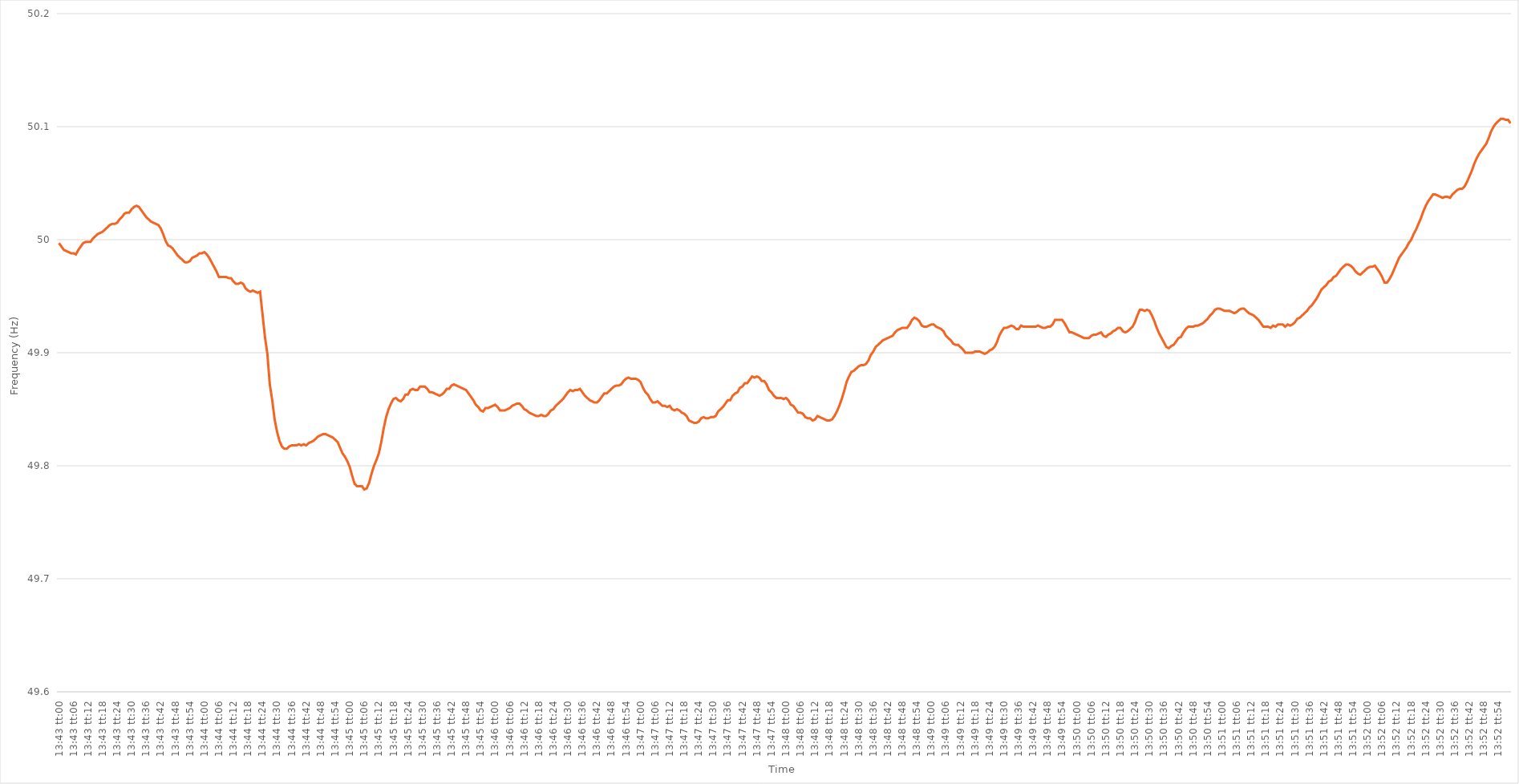
| Category | Series 0 |
|---|---|
| 0.5715277777777777 | 49.997 |
| 0.5715393518518518 | 49.994 |
| 0.5715509259259259 | 49.991 |
| 0.5715625 | 49.99 |
| 0.5715740740740741 | 49.989 |
| 0.5715856481481482 | 49.988 |
| 0.5715972222222222 | 49.988 |
| 0.5716087962962962 | 49.987 |
| 0.5716203703703704 | 49.991 |
| 0.5716319444444444 | 49.994 |
| 0.5716435185185186 | 49.997 |
| 0.5716550925925926 | 49.998 |
| 0.5716666666666667 | 49.998 |
| 0.5716782407407407 | 49.998 |
| 0.5716898148148148 | 50.001 |
| 0.5717013888888889 | 50.003 |
| 0.571712962962963 | 50.005 |
| 0.5717245370370371 | 50.006 |
| 0.5717361111111111 | 50.007 |
| 0.5717476851851852 | 50.009 |
| 0.5717592592592592 | 50.011 |
| 0.5717708333333333 | 50.013 |
| 0.5717824074074074 | 50.014 |
| 0.5717939814814815 | 50.014 |
| 0.5718055555555556 | 50.015 |
| 0.5718171296296296 | 50.018 |
| 0.5718287037037036 | 50.02 |
| 0.5718402777777778 | 50.023 |
| 0.5718518518518518 | 50.024 |
| 0.571863425925926 | 50.024 |
| 0.571875 | 50.027 |
| 0.5718865740740741 | 50.029 |
| 0.5718981481481481 | 50.03 |
| 0.5719097222222222 | 50.029 |
| 0.5719212962962963 | 50.026 |
| 0.5719328703703704 | 50.023 |
| 0.5719444444444445 | 50.02 |
| 0.5719560185185185 | 50.018 |
| 0.5719675925925926 | 50.016 |
| 0.5719791666666666 | 50.015 |
| 0.5719907407407407 | 50.014 |
| 0.5720023148148148 | 50.013 |
| 0.5720138888888889 | 50.01 |
| 0.572025462962963 | 50.005 |
| 0.572037037037037 | 49.999 |
| 0.572048611111111 | 49.995 |
| 0.5720601851851852 | 49.994 |
| 0.5720717592592592 | 49.992 |
| 0.5720833333333334 | 49.989 |
| 0.5720949074074074 | 49.986 |
| 0.5721064814814815 | 49.984 |
| 0.5721180555555555 | 49.982 |
| 0.5721296296296297 | 49.98 |
| 0.5721412037037037 | 49.98 |
| 0.5721527777777778 | 49.981 |
| 0.5721643518518519 | 49.984 |
| 0.5721759259259259 | 49.985 |
| 0.5721875 | 49.986 |
| 0.5721990740740741 | 49.988 |
| 0.5722106481481481 | 49.988 |
| 0.5722222222222222 | 49.989 |
| 0.5722337962962963 | 49.987 |
| 0.5722453703703704 | 49.984 |
| 0.5722569444444444 | 49.98 |
| 0.5722685185185185 | 49.976 |
| 0.5722800925925926 | 49.972 |
| 0.5722916666666666 | 49.967 |
| 0.5723032407407408 | 49.967 |
| 0.5723148148148148 | 49.967 |
| 0.5723263888888889 | 49.967 |
| 0.5723379629629629 | 49.966 |
| 0.5723495370370371 | 49.966 |
| 0.5723611111111111 | 49.963 |
| 0.5723726851851852 | 49.961 |
| 0.5723842592592593 | 49.961 |
| 0.5723958333333333 | 49.962 |
| 0.5724074074074074 | 49.961 |
| 0.5724189814814815 | 49.957 |
| 0.5724305555555556 | 49.955 |
| 0.5724421296296297 | 49.954 |
| 0.5724537037037037 | 49.955 |
| 0.5724652777777778 | 49.954 |
| 0.5724768518518518 | 49.953 |
| 0.5724884259259259 | 49.954 |
| 0.5725 | 49.934 |
| 0.572511574074074 | 49.914 |
| 0.5725231481481482 | 49.899 |
| 0.5725347222222222 | 49.872 |
| 0.5725462962962963 | 49.858 |
| 0.5725578703703703 | 49.841 |
| 0.5725694444444445 | 49.83 |
| 0.5725810185185185 | 49.822 |
| 0.5725925925925927 | 49.817 |
| 0.5726041666666667 | 49.815 |
| 0.5726157407407407 | 49.815 |
| 0.5726273148148148 | 49.817 |
| 0.5726388888888889 | 49.818 |
| 0.572650462962963 | 49.818 |
| 0.5726620370370371 | 49.818 |
| 0.5726736111111111 | 49.819 |
| 0.5726851851851852 | 49.818 |
| 0.5726967592592592 | 49.819 |
| 0.5727083333333333 | 49.818 |
| 0.5727199074074074 | 49.82 |
| 0.5727314814814815 | 49.821 |
| 0.5727430555555556 | 49.822 |
| 0.5727546296296296 | 49.824 |
| 0.5727662037037037 | 49.826 |
| 0.5727777777777777 | 49.827 |
| 0.5727893518518519 | 49.828 |
| 0.5728009259259259 | 49.828 |
| 0.5728125000000001 | 49.827 |
| 0.5728240740740741 | 49.826 |
| 0.5728356481481481 | 49.825 |
| 0.5728472222222222 | 49.823 |
| 0.5728587962962963 | 49.821 |
| 0.5728703703703704 | 49.816 |
| 0.5728819444444445 | 49.811 |
| 0.5728935185185186 | 49.808 |
| 0.5729050925925926 | 49.804 |
| 0.5729166666666666 | 49.799 |
| 0.5729282407407407 | 49.791 |
| 0.5729398148148148 | 49.784 |
| 0.5729513888888889 | 49.782 |
| 0.572962962962963 | 49.782 |
| 0.572974537037037 | 49.782 |
| 0.5729861111111111 | 49.779 |
| 0.5729976851851851 | 49.78 |
| 0.5730092592592593 | 49.785 |
| 0.5730208333333333 | 49.793 |
| 0.5730324074074075 | 49.8 |
| 0.5730439814814815 | 49.805 |
| 0.5730555555555555 | 49.811 |
| 0.5730671296296296 | 49.821 |
| 0.5730787037037037 | 49.833 |
| 0.5730902777777778 | 49.843 |
| 0.5731018518518519 | 49.85 |
| 0.573113425925926 | 49.855 |
| 0.573125 | 49.859 |
| 0.573136574074074 | 49.86 |
| 0.5731481481481482 | 49.858 |
| 0.5731597222222222 | 49.857 |
| 0.5731712962962963 | 49.859 |
| 0.5731828703703704 | 49.863 |
| 0.5731944444444445 | 49.863 |
| 0.5732060185185185 | 49.867 |
| 0.5732175925925925 | 49.868 |
| 0.5732291666666667 | 49.867 |
| 0.5732407407407407 | 49.867 |
| 0.5732523148148149 | 49.87 |
| 0.5732638888888889 | 49.87 |
| 0.573275462962963 | 49.87 |
| 0.573287037037037 | 49.868 |
| 0.5732986111111111 | 49.865 |
| 0.5733101851851852 | 49.865 |
| 0.5733217592592593 | 49.864 |
| 0.5733333333333334 | 49.863 |
| 0.5733449074074074 | 49.862 |
| 0.5733564814814814 | 49.863 |
| 0.5733680555555556 | 49.865 |
| 0.5733796296296296 | 49.868 |
| 0.5733912037037037 | 49.868 |
| 0.5734027777777778 | 49.871 |
| 0.5734143518518519 | 49.872 |
| 0.5734259259259259 | 49.871 |
| 0.5734374999999999 | 49.87 |
| 0.5734490740740741 | 49.869 |
| 0.5734606481481481 | 49.868 |
| 0.5734722222222223 | 49.867 |
| 0.5734837962962963 | 49.864 |
| 0.5734953703703703 | 49.861 |
| 0.5735069444444444 | 49.858 |
| 0.5735185185185185 | 49.854 |
| 0.5735300925925926 | 49.852 |
| 0.5735416666666667 | 49.849 |
| 0.5735532407407408 | 49.848 |
| 0.5735648148148148 | 49.851 |
| 0.5735763888888888 | 49.851 |
| 0.573587962962963 | 49.852 |
| 0.573599537037037 | 49.853 |
| 0.5736111111111112 | 49.854 |
| 0.5736226851851852 | 49.852 |
| 0.5736342592592593 | 49.849 |
| 0.5736458333333333 | 49.849 |
| 0.5736574074074073 | 49.849 |
| 0.5736689814814815 | 49.85 |
| 0.5736805555555555 | 49.851 |
| 0.5736921296296297 | 49.853 |
| 0.5737037037037037 | 49.854 |
| 0.5737152777777778 | 49.855 |
| 0.5737268518518518 | 49.855 |
| 0.5737384259259259 | 49.853 |
| 0.57375 | 49.85 |
| 0.5737615740740741 | 49.849 |
| 0.5737731481481482 | 49.847 |
| 0.5737847222222222 | 49.846 |
| 0.5737962962962962 | 49.845 |
| 0.5738078703703704 | 49.844 |
| 0.5738194444444444 | 49.844 |
| 0.5738310185185186 | 49.845 |
| 0.5738425925925926 | 49.844 |
| 0.5738541666666667 | 49.844 |
| 0.5738657407407407 | 49.846 |
| 0.5738773148148147 | 49.849 |
| 0.5738888888888889 | 49.85 |
| 0.5739004629629629 | 49.853 |
| 0.5739120370370371 | 49.855 |
| 0.5739236111111111 | 49.857 |
| 0.5739351851851852 | 49.859 |
| 0.5739467592592592 | 49.862 |
| 0.5739583333333333 | 49.865 |
| 0.5739699074074074 | 49.867 |
| 0.5739814814814815 | 49.866 |
| 0.5739930555555556 | 49.867 |
| 0.5740046296296296 | 49.867 |
| 0.5740162037037037 | 49.868 |
| 0.5740277777777778 | 49.865 |
| 0.5740393518518518 | 49.862 |
| 0.574050925925926 | 49.86 |
| 0.5740625 | 49.858 |
| 0.5740740740740741 | 49.857 |
| 0.5740856481481481 | 49.856 |
| 0.5740972222222223 | 49.856 |
| 0.5741087962962963 | 49.858 |
| 0.5741203703703703 | 49.861 |
| 0.5741319444444445 | 49.864 |
| 0.5741435185185185 | 49.864 |
| 0.5741550925925926 | 49.866 |
| 0.5741666666666666 | 49.868 |
| 0.5741782407407408 | 49.87 |
| 0.5741898148148148 | 49.871 |
| 0.5742013888888889 | 49.871 |
| 0.574212962962963 | 49.872 |
| 0.574224537037037 | 49.875 |
| 0.5742361111111111 | 49.877 |
| 0.5742476851851852 | 49.878 |
| 0.5742592592592592 | 49.877 |
| 0.5742708333333334 | 49.877 |
| 0.5742824074074074 | 49.877 |
| 0.5742939814814815 | 49.876 |
| 0.5743055555555555 | 49.874 |
| 0.5743171296296297 | 49.869 |
| 0.5743287037037037 | 49.865 |
| 0.5743402777777777 | 49.863 |
| 0.5743518518518519 | 49.859 |
| 0.5743634259259259 | 49.856 |
| 0.574375 | 49.856 |
| 0.574386574074074 | 49.857 |
| 0.5743981481481482 | 49.855 |
| 0.5744097222222222 | 49.853 |
| 0.5744212962962963 | 49.853 |
| 0.5744328703703704 | 49.852 |
| 0.5744444444444444 | 49.853 |
| 0.5744560185185185 | 49.85 |
| 0.5744675925925926 | 49.849 |
| 0.5744791666666667 | 49.85 |
| 0.5744907407407408 | 49.849 |
| 0.5745023148148148 | 49.847 |
| 0.5745138888888889 | 49.846 |
| 0.5745254629629629 | 49.844 |
| 0.5745370370370371 | 49.84 |
| 0.5745486111111111 | 49.839 |
| 0.5745601851851853 | 49.838 |
| 0.5745717592592593 | 49.838 |
| 0.5745833333333333 | 49.839 |
| 0.5745949074074074 | 49.842 |
| 0.5746064814814814 | 49.843 |
| 0.5746180555555556 | 49.842 |
| 0.5746296296296296 | 49.842 |
| 0.5746412037037038 | 49.843 |
| 0.5746527777777778 | 49.843 |
| 0.5746643518518518 | 49.844 |
| 0.5746759259259259 | 49.848 |
| 0.5746875 | 49.85 |
| 0.5746990740740741 | 49.852 |
| 0.5747106481481482 | 49.855 |
| 0.5747222222222222 | 49.858 |
| 0.5747337962962963 | 49.858 |
| 0.5747453703703703 | 49.862 |
| 0.5747569444444445 | 49.864 |
| 0.5747685185185185 | 49.865 |
| 0.5747800925925927 | 49.869 |
| 0.5747916666666667 | 49.87 |
| 0.5748032407407407 | 49.873 |
| 0.5748148148148148 | 49.873 |
| 0.5748263888888888 | 49.876 |
| 0.574837962962963 | 49.879 |
| 0.574849537037037 | 49.878 |
| 0.5748611111111112 | 49.879 |
| 0.5748726851851852 | 49.878 |
| 0.5748842592592592 | 49.875 |
| 0.5748958333333333 | 49.875 |
| 0.5749074074074074 | 49.872 |
| 0.5749189814814815 | 49.867 |
| 0.5749305555555556 | 49.865 |
| 0.5749421296296297 | 49.862 |
| 0.5749537037037037 | 49.86 |
| 0.5749652777777777 | 49.86 |
| 0.5749768518518519 | 49.86 |
| 0.5749884259259259 | 49.859 |
| 0.5750000000000001 | 49.86 |
| 0.5750115740740741 | 49.858 |
| 0.5750231481481481 | 49.854 |
| 0.5750347222222222 | 49.853 |
| 0.5750462962962963 | 49.85 |
| 0.5750578703703704 | 49.847 |
| 0.5750694444444444 | 49.847 |
| 0.5750810185185186 | 49.846 |
| 0.5750925925925926 | 49.843 |
| 0.5751041666666666 | 49.842 |
| 0.5751157407407407 | 49.842 |
| 0.5751273148148148 | 49.84 |
| 0.5751388888888889 | 49.841 |
| 0.575150462962963 | 49.844 |
| 0.575162037037037 | 49.843 |
| 0.5751736111111111 | 49.842 |
| 0.5751851851851851 | 49.841 |
| 0.5751967592592593 | 49.84 |
| 0.5752083333333333 | 49.84 |
| 0.5752199074074075 | 49.841 |
| 0.5752314814814815 | 49.844 |
| 0.5752430555555555 | 49.848 |
| 0.5752546296296296 | 49.853 |
| 0.5752662037037037 | 49.859 |
| 0.5752777777777778 | 49.866 |
| 0.5752893518518518 | 49.874 |
| 0.575300925925926 | 49.879 |
| 0.5753125 | 49.883 |
| 0.575324074074074 | 49.884 |
| 0.5753356481481481 | 49.886 |
| 0.5753472222222222 | 49.888 |
| 0.5753587962962963 | 49.889 |
| 0.5753703703703704 | 49.889 |
| 0.5753819444444445 | 49.89 |
| 0.5753935185185185 | 49.893 |
| 0.5754050925925925 | 49.898 |
| 0.5754166666666667 | 49.901 |
| 0.5754282407407407 | 49.905 |
| 0.5754398148148149 | 49.907 |
| 0.5754513888888889 | 49.909 |
| 0.575462962962963 | 49.911 |
| 0.575474537037037 | 49.912 |
| 0.5754861111111111 | 49.913 |
| 0.5754976851851852 | 49.914 |
| 0.5755092592592593 | 49.915 |
| 0.5755208333333334 | 49.918 |
| 0.5755324074074074 | 49.92 |
| 0.5755439814814814 | 49.921 |
| 0.5755555555555555 | 49.922 |
| 0.5755671296296296 | 49.922 |
| 0.5755787037037037 | 49.922 |
| 0.5755902777777778 | 49.925 |
| 0.5756018518518519 | 49.929 |
| 0.5756134259259259 | 49.931 |
| 0.5756249999999999 | 49.93 |
| 0.5756365740740741 | 49.928 |
| 0.5756481481481481 | 49.924 |
| 0.5756597222222223 | 49.923 |
| 0.5756712962962963 | 49.923 |
| 0.5756828703703704 | 49.924 |
| 0.5756944444444444 | 49.925 |
| 0.5757060185185185 | 49.925 |
| 0.5757175925925926 | 49.923 |
| 0.5757291666666667 | 49.922 |
| 0.5757407407407408 | 49.921 |
| 0.5757523148148148 | 49.919 |
| 0.5757638888888889 | 49.915 |
| 0.5757754629629629 | 49.913 |
| 0.575787037037037 | 49.911 |
| 0.5757986111111111 | 49.908 |
| 0.5758101851851852 | 49.907 |
| 0.5758217592592593 | 49.907 |
| 0.5758333333333333 | 49.905 |
| 0.5758449074074073 | 49.903 |
| 0.5758564814814815 | 49.9 |
| 0.5758680555555555 | 49.9 |
| 0.5758796296296297 | 49.9 |
| 0.5758912037037037 | 49.9 |
| 0.5759027777777778 | 49.901 |
| 0.5759143518518518 | 49.901 |
| 0.575925925925926 | 49.901 |
| 0.5759375 | 49.9 |
| 0.5759490740740741 | 49.899 |
| 0.5759606481481482 | 49.9 |
| 0.5759722222222222 | 49.902 |
| 0.5759837962962963 | 49.903 |
| 0.5759953703703703 | 49.905 |
| 0.5760069444444444 | 49.909 |
| 0.5760185185185185 | 49.915 |
| 0.5760300925925926 | 49.919 |
| 0.5760416666666667 | 49.922 |
| 0.5760532407407407 | 49.922 |
| 0.5760648148148148 | 49.923 |
| 0.5760763888888889 | 49.924 |
| 0.5760879629629629 | 49.923 |
| 0.5760995370370371 | 49.921 |
| 0.5761111111111111 | 49.921 |
| 0.5761226851851852 | 49.924 |
| 0.5761342592592592 | 49.923 |
| 0.5761458333333334 | 49.923 |
| 0.5761574074074074 | 49.923 |
| 0.5761689814814815 | 49.923 |
| 0.5761805555555556 | 49.923 |
| 0.5761921296296296 | 49.923 |
| 0.5762037037037037 | 49.924 |
| 0.5762152777777778 | 49.923 |
| 0.5762268518518519 | 49.922 |
| 0.5762384259259259 | 49.922 |
| 0.57625 | 49.923 |
| 0.5762615740740741 | 49.923 |
| 0.5762731481481481 | 49.925 |
| 0.5762847222222222 | 49.929 |
| 0.5762962962962963 | 49.929 |
| 0.5763078703703703 | 49.929 |
| 0.5763194444444445 | 49.929 |
| 0.5763310185185185 | 49.926 |
| 0.5763425925925926 | 49.922 |
| 0.5763541666666666 | 49.918 |
| 0.5763657407407408 | 49.918 |
| 0.5763773148148148 | 49.917 |
| 0.576388888888889 | 49.916 |
| 0.576400462962963 | 49.915 |
| 0.576412037037037 | 49.914 |
| 0.5764236111111111 | 49.913 |
| 0.5764351851851852 | 49.913 |
| 0.5764467592592593 | 49.913 |
| 0.5764583333333334 | 49.915 |
| 0.5764699074074074 | 49.916 |
| 0.5764814814814815 | 49.916 |
| 0.5764930555555555 | 49.917 |
| 0.5765046296296296 | 49.918 |
| 0.5765162037037037 | 49.915 |
| 0.5765277777777778 | 49.914 |
| 0.5765393518518519 | 49.916 |
| 0.5765509259259259 | 49.917 |
| 0.5765625 | 49.919 |
| 0.576574074074074 | 49.92 |
| 0.5765856481481482 | 49.922 |
| 0.5765972222222222 | 49.922 |
| 0.5766087962962964 | 49.919 |
| 0.5766203703703704 | 49.918 |
| 0.5766319444444444 | 49.919 |
| 0.5766435185185185 | 49.921 |
| 0.5766550925925926 | 49.923 |
| 0.5766666666666667 | 49.927 |
| 0.5766782407407408 | 49.933 |
| 0.5766898148148148 | 49.938 |
| 0.5767013888888889 | 49.938 |
| 0.5767129629629629 | 49.937 |
| 0.576724537037037 | 49.938 |
| 0.5767361111111111 | 49.937 |
| 0.5767476851851852 | 49.933 |
| 0.5767592592592593 | 49.928 |
| 0.5767708333333333 | 49.922 |
| 0.5767824074074074 | 49.917 |
| 0.5767939814814814 | 49.913 |
| 0.5768055555555556 | 49.909 |
| 0.5768171296296296 | 49.905 |
| 0.5768287037037038 | 49.904 |
| 0.5768402777777778 | 49.906 |
| 0.5768518518518518 | 49.907 |
| 0.5768634259259259 | 49.91 |
| 0.576875 | 49.913 |
| 0.5768865740740741 | 49.914 |
| 0.5768981481481482 | 49.918 |
| 0.5769097222222223 | 49.921 |
| 0.5769212962962963 | 49.923 |
| 0.5769328703703703 | 49.923 |
| 0.5769444444444444 | 49.923 |
| 0.5769560185185185 | 49.924 |
| 0.5769675925925926 | 49.924 |
| 0.5769791666666667 | 49.925 |
| 0.5769907407407407 | 49.926 |
| 0.5770023148148148 | 49.928 |
| 0.5770138888888888 | 49.93 |
| 0.577025462962963 | 49.933 |
| 0.577037037037037 | 49.935 |
| 0.5770486111111112 | 49.938 |
| 0.5770601851851852 | 49.939 |
| 0.5770717592592592 | 49.939 |
| 0.5770833333333333 | 49.938 |
| 0.5770949074074074 | 49.937 |
| 0.5771064814814815 | 49.937 |
| 0.5771180555555556 | 49.937 |
| 0.5771296296296297 | 49.936 |
| 0.5771412037037037 | 49.935 |
| 0.5771527777777777 | 49.936 |
| 0.5771643518518519 | 49.938 |
| 0.5771759259259259 | 49.939 |
| 0.5771875 | 49.939 |
| 0.5771990740740741 | 49.937 |
| 0.5772106481481482 | 49.935 |
| 0.5772222222222222 | 49.934 |
| 0.5772337962962962 | 49.933 |
| 0.5772453703703704 | 49.931 |
| 0.5772569444444444 | 49.929 |
| 0.5772685185185186 | 49.926 |
| 0.5772800925925926 | 49.923 |
| 0.5772916666666666 | 49.923 |
| 0.5773032407407407 | 49.923 |
| 0.5773148148148148 | 49.922 |
| 0.5773263888888889 | 49.924 |
| 0.577337962962963 | 49.923 |
| 0.5773495370370371 | 49.925 |
| 0.5773611111111111 | 49.925 |
| 0.5773726851851851 | 49.925 |
| 0.5773842592592593 | 49.923 |
| 0.5773958333333333 | 49.925 |
| 0.5774074074074075 | 49.924 |
| 0.5774189814814815 | 49.925 |
| 0.5774305555555556 | 49.927 |
| 0.5774421296296296 | 49.93 |
| 0.5774537037037036 | 49.931 |
| 0.5774652777777778 | 49.933 |
| 0.5774768518518518 | 49.935 |
| 0.577488425925926 | 49.937 |
| 0.5775 | 49.94 |
| 0.577511574074074 | 49.942 |
| 0.5775231481481481 | 49.945 |
| 0.5775347222222222 | 49.948 |
| 0.5775462962962963 | 49.952 |
| 0.5775578703703704 | 49.956 |
| 0.5775694444444445 | 49.958 |
| 0.5775810185185185 | 49.96 |
| 0.5775925925925925 | 49.963 |
| 0.5776041666666667 | 49.964 |
| 0.5776157407407407 | 49.967 |
| 0.5776273148148149 | 49.968 |
| 0.5776388888888889 | 49.971 |
| 0.577650462962963 | 49.974 |
| 0.577662037037037 | 49.976 |
| 0.577673611111111 | 49.978 |
| 0.5776851851851852 | 49.978 |
| 0.5776967592592592 | 49.977 |
| 0.5777083333333334 | 49.975 |
| 0.5777199074074074 | 49.972 |
| 0.5777314814814815 | 49.97 |
| 0.5777430555555555 | 49.969 |
| 0.5777546296296296 | 49.971 |
| 0.5777662037037037 | 49.973 |
| 0.5777777777777778 | 49.975 |
| 0.5777893518518519 | 49.976 |
| 0.5778009259259259 | 49.976 |
| 0.5778125 | 49.977 |
| 0.5778240740740741 | 49.974 |
| 0.5778356481481481 | 49.971 |
| 0.5778472222222223 | 49.967 |
| 0.5778587962962963 | 49.962 |
| 0.5778703703703704 | 49.962 |
| 0.5778819444444444 | 49.965 |
| 0.5778935185185184 | 49.969 |
| 0.5779050925925926 | 49.974 |
| 0.5779166666666666 | 49.979 |
| 0.5779282407407408 | 49.984 |
| 0.5779398148148148 | 49.987 |
| 0.5779513888888889 | 49.99 |
| 0.5779629629629629 | 49.993 |
| 0.577974537037037 | 49.997 |
| 0.5779861111111111 | 50 |
| 0.5779976851851852 | 50.005 |
| 0.5780092592592593 | 50.009 |
| 0.5780208333333333 | 50.014 |
| 0.5780324074074074 | 50.019 |
| 0.5780439814814815 | 50.025 |
| 0.5780555555555555 | 50.03 |
| 0.5780671296296297 | 50.034 |
| 0.5780787037037037 | 50.037 |
| 0.5780902777777778 | 50.04 |
| 0.5781018518518518 | 50.04 |
| 0.578113425925926 | 50.039 |
| 0.578125 | 50.038 |
| 0.578136574074074 | 50.037 |
| 0.5781481481481482 | 50.038 |
| 0.5781597222222222 | 50.038 |
| 0.5781712962962963 | 50.037 |
| 0.5781828703703703 | 50.04 |
| 0.5781944444444445 | 50.042 |
| 0.5782060185185185 | 50.044 |
| 0.5782175925925926 | 50.045 |
| 0.5782291666666667 | 50.045 |
| 0.5782407407407407 | 50.047 |
| 0.5782523148148148 | 50.051 |
| 0.5782638888888889 | 50.056 |
| 0.578275462962963 | 50.061 |
| 0.5782870370370371 | 50.067 |
| 0.5782986111111111 | 50.072 |
| 0.5783101851851852 | 50.076 |
| 0.5783217592592592 | 50.079 |
| 0.5783333333333334 | 50.082 |
| 0.5783449074074074 | 50.085 |
| 0.5783564814814816 | 50.09 |
| 0.5783680555555556 | 50.096 |
| 0.5783796296296296 | 50.1 |
| 0.5783912037037037 | 50.103 |
| 0.5784027777777777 | 50.105 |
| 0.5784143518518519 | 50.107 |
| 0.5784259259259259 | 50.107 |
| 0.5784375 | 50.106 |
| 0.5784490740740741 | 50.106 |
| 0.5784606481481481 | 50.103 |